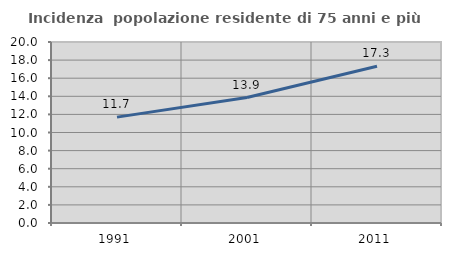
| Category | Incidenza  popolazione residente di 75 anni e più |
|---|---|
| 1991.0 | 11.698 |
| 2001.0 | 13.86 |
| 2011.0 | 17.327 |